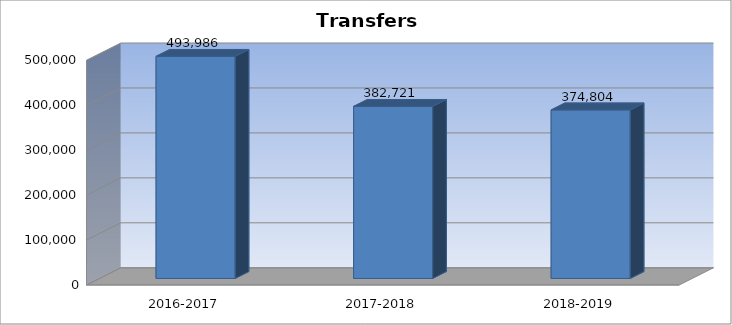
| Category | Transfers (5200) |
|---|---|
| 2016-2017 | 493986 |
| 2017-2018 | 382721 |
| 2018-2019 | 374804 |